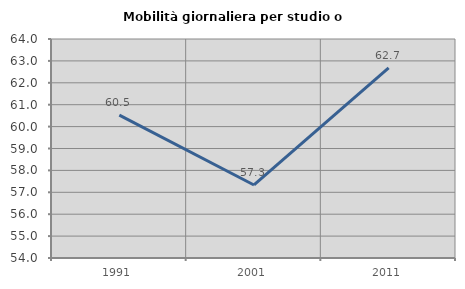
| Category | Mobilità giornaliera per studio o lavoro |
|---|---|
| 1991.0 | 60.526 |
| 2001.0 | 57.334 |
| 2011.0 | 62.681 |